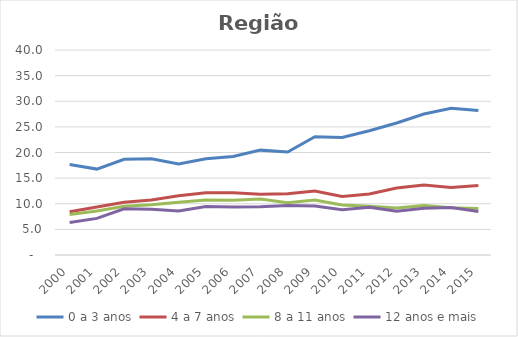
| Category | 0 a 3 anos | 4 a 7 anos | 8 a 11 anos | 12 anos e mais |
|---|---|---|---|---|
| 2000.0 | 17.65 | 8.445 | 7.887 | 6.348 |
| 2001.0 | 16.761 | 9.384 | 8.602 | 7.142 |
| 2002.0 | 18.662 | 10.305 | 9.508 | 9.015 |
| 2003.0 | 18.796 | 10.748 | 9.818 | 8.91 |
| 2004.0 | 17.779 | 11.566 | 10.279 | 8.567 |
| 2005.0 | 18.792 | 12.151 | 10.73 | 9.462 |
| 2006.0 | 19.226 | 12.169 | 10.682 | 9.364 |
| 2007.0 | 20.461 | 11.857 | 10.937 | 9.412 |
| 2008.0 | 20.101 | 11.967 | 10.216 | 9.647 |
| 2009.0 | 23.064 | 12.483 | 10.722 | 9.547 |
| 2010.0 | 22.942 | 11.42 | 9.743 | 8.82 |
| 2011.0 | 24.241 | 11.913 | 9.497 | 9.308 |
| 2012.0 | 25.754 | 13.079 | 9.164 | 8.544 |
| 2013.0 | 27.512 | 13.656 | 9.655 | 9.117 |
| 2014.0 | 28.639 | 13.194 | 9.234 | 9.257 |
| 2015.0 | 28.209 | 13.557 | 9.065 | 8.475 |